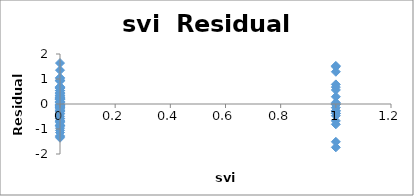
| Category | Series 0 |
|---|---|
| 0.0 | -1.305 |
| 0.0 | -0.887 |
| 0.0 | -0.706 |
| 0.0 | -0.747 |
| 0.0 | -1.35 |
| 0.0 | -0.042 |
| 0.0 | -1.141 |
| 0.0 | -1.273 |
| 0.0 | -0.12 |
| 0.0 | -0.259 |
| 0.0 | -0.182 |
| 0.0 | 0.437 |
| 0.0 | -0.853 |
| 0.0 | -0.572 |
| 0.0 | -0.659 |
| 0.0 | -0.491 |
| 0.0 | 0.173 |
| 0.0 | -0.966 |
| 0.0 | 0.27 |
| 0.0 | -0.135 |
| 0.0 | -0.368 |
| 0.0 | -1.055 |
| 0.0 | 0.639 |
| 0.0 | -0.843 |
| 0.0 | -0.064 |
| 0.0 | -0.286 |
| 0.0 | -0.153 |
| 0.0 | 0.194 |
| 0.0 | -0.235 |
| 0.0 | -0.399 |
| 0.0 | -0.06 |
| 0.0 | -0.867 |
| 0.0 | 0.051 |
| 0.0 | 0.653 |
| 0.0 | 0.953 |
| 0.0 | -0.685 |
| 0.0 | 0.232 |
| 0.0 | 1.05 |
| 1.0 | -1.733 |
| 0.0 | 0.414 |
| 0.0 | 0.248 |
| 0.0 | 0.094 |
| 0.0 | 0.277 |
| 0.0 | -0.017 |
| 0.0 | 0.087 |
| 0.0 | -0.033 |
| 1.0 | -1.512 |
| 0.0 | -0.008 |
| 0.0 | -0.117 |
| 0.0 | 0.456 |
| 0.0 | 0.327 |
| 0.0 | -0.273 |
| 0.0 | 0.532 |
| 0.0 | -0.298 |
| 0.0 | -0.592 |
| 0.0 | -0.101 |
| 0.0 | 1.035 |
| 0.0 | 0.535 |
| 0.0 | 0.695 |
| 0.0 | 0.186 |
| 0.0 | 0.615 |
| 1.0 | -0.677 |
| 0.0 | -0.157 |
| 1.0 | -0.812 |
| 0.0 | 0.337 |
| 0.0 | 0.223 |
| 0.0 | -0.048 |
| 0.0 | -0.078 |
| 0.0 | 1.638 |
| 0.0 | 0.172 |
| 1.0 | -0.271 |
| 0.0 | 0.918 |
| 1.0 | 0.29 |
| 1.0 | -0.469 |
| 1.0 | -0.372 |
| 1.0 | -0.371 |
| 0.0 | 0.18 |
| 0.0 | 0.073 |
| 1.0 | -0.017 |
| 0.0 | 0.357 |
| 0.0 | 1.352 |
| 0.0 | 0.538 |
| 1.0 | 0.004 |
| 0.0 | 0.204 |
| 0.0 | 0.946 |
| 1.0 | -0.279 |
| 0.0 | 0.673 |
| 1.0 | 0.675 |
| 1.0 | -0.146 |
| 1.0 | 0.784 |
| 0.0 | 0.657 |
| 1.0 | 0.059 |
| 1.0 | 0.562 |
| 1.0 | -0.021 |
| 1.0 | 1.526 |
| 1.0 | 1.29 |
| 1.0 | 1.491 |